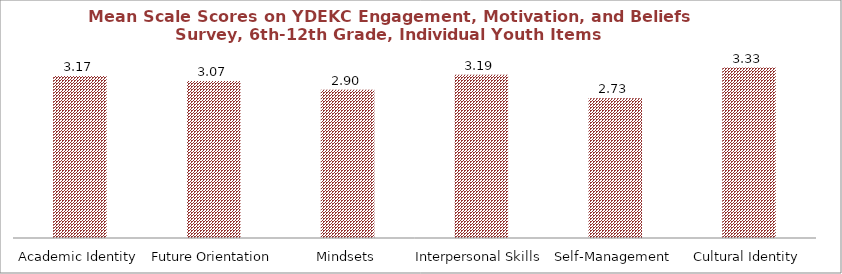
| Category | Series 0 |
|---|---|
| Academic Identity | 3.167 |
| Future Orientation | 3.071 |
| Mindsets | 2.898 |
| Interpersonal Skills | 3.19 |
| Self-Management | 2.735 |
| Cultural Identity | 3.333 |